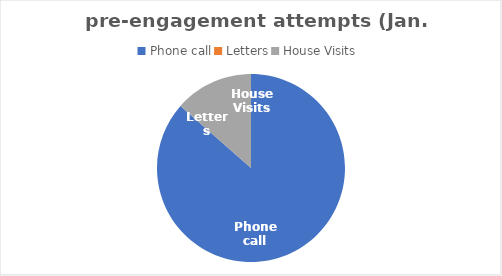
| Category | Series 0 |
|---|---|
| Phone call | 32 |
| Letters | 0 |
| House Visits | 5 |